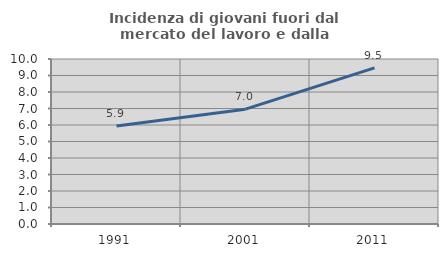
| Category | Incidenza di giovani fuori dal mercato del lavoro e dalla formazione  |
|---|---|
| 1991.0 | 5.941 |
| 2001.0 | 6.958 |
| 2011.0 | 9.464 |